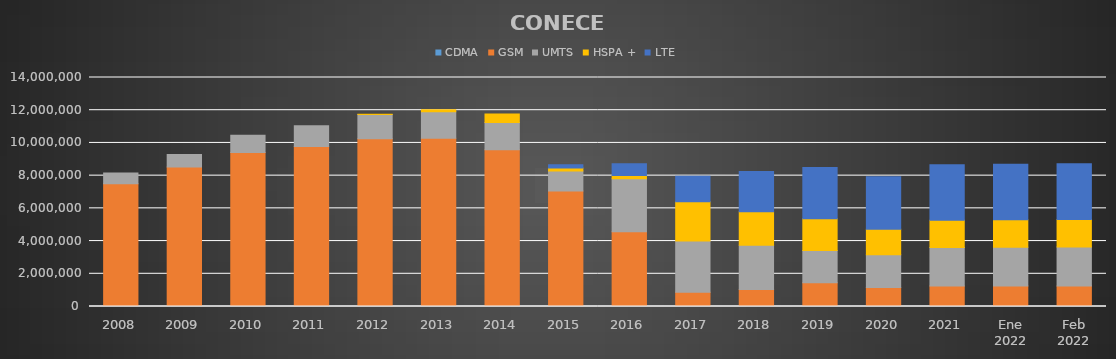
| Category | CDMA | GSM | UMTS | HSPA + | LTE |
|---|---|---|---|---|---|
| 2008 | 0 | 7499370 | 656989 | 0 | 0 |
| 2009 | 0 | 8532691 | 758577 | 0 | 0 |
| 2010 | 0 | 9419193 | 1051309 | 0 | 0 |
| 2011 | 0 | 9774865 | 1282451 | 0 | 0 |
| 2012 | 0 | 10252457 | 1484003 | 21446 | 0 |
| 2013 | 0 | 10287259 | 1622034 | 121593 | 0 |
| 2014 | 0 | 9581956 | 1664758 | 525306 | 0 |
| 2015 | 0 | 7065313 | 1214567 | 183109 | 195630 |
| 2016 | 0 | 4571999 | 3240700 | 201567 | 712557 |
| 2017 | 0 | 873346 | 3135577 | 2399460 | 1551880 |
| 2018 | 0 | 1039373 | 2706058 | 2049418 | 2453201 |
| 2019 | 0 | 1452334 | 1970422 | 1937931 | 3132367 |
| 2020 | 0 | 1158751 | 2009264 | 1548440 | 3212798 |
| 2021 | 0 | 1250925 | 2353798 | 1675346 | 3385646 |
| Ene 2022 | 0 | 1253803 | 2367204 | 1682872 | 3391452 |
| Feb 2022 | 0 | 1256245 | 2379435 | 1688963 | 3397299 |